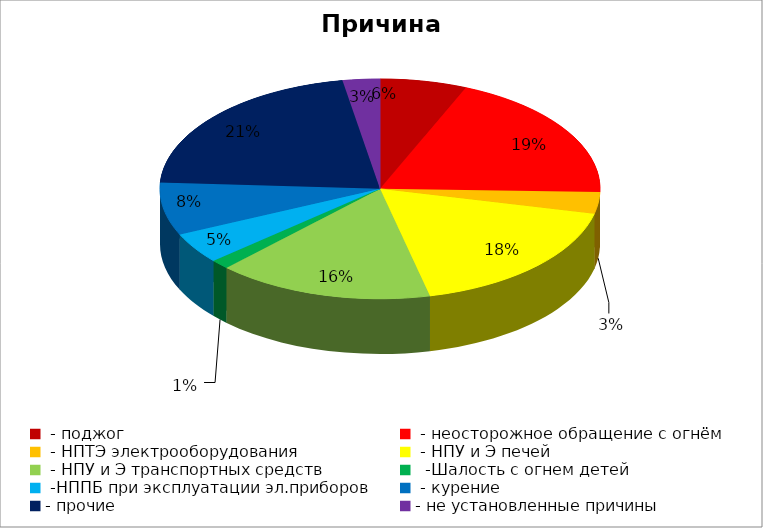
| Category | Причина пожара |
|---|---|
|  - поджог | 14 |
|  - неосторожное обращение с огнём | 42 |
|  - НПТЭ электрооборудования | 7 |
|  - НПУ и Э печей | 39 |
|  - НПУ и Э транспортных средств | 35 |
|   -Шалость с огнем детей | 3 |
|  -НППБ при эксплуатации эл.приборов | 10 |
|  - курение | 17 |
| - прочие | 47 |
| - не установленные причины | 6 |